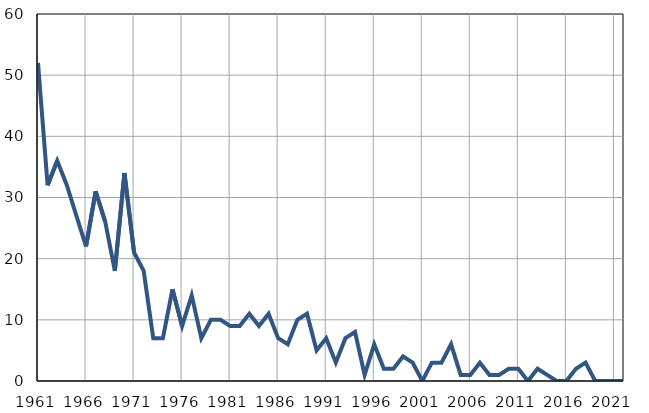
| Category | Infants
deaths |
|---|---|
| 1961.0 | 52 |
| 1962.0 | 32 |
| 1963.0 | 36 |
| 1964.0 | 32 |
| 1965.0 | 27 |
| 1966.0 | 22 |
| 1967.0 | 31 |
| 1968.0 | 26 |
| 1969.0 | 18 |
| 1970.0 | 34 |
| 1971.0 | 21 |
| 1972.0 | 18 |
| 1973.0 | 7 |
| 1974.0 | 7 |
| 1975.0 | 15 |
| 1976.0 | 9 |
| 1977.0 | 14 |
| 1978.0 | 7 |
| 1979.0 | 10 |
| 1980.0 | 10 |
| 1981.0 | 9 |
| 1982.0 | 9 |
| 1983.0 | 11 |
| 1984.0 | 9 |
| 1985.0 | 11 |
| 1986.0 | 7 |
| 1987.0 | 6 |
| 1988.0 | 10 |
| 1989.0 | 11 |
| 1990.0 | 5 |
| 1991.0 | 7 |
| 1992.0 | 3 |
| 1993.0 | 7 |
| 1994.0 | 8 |
| 1995.0 | 1 |
| 1996.0 | 6 |
| 1997.0 | 2 |
| 1998.0 | 2 |
| 1999.0 | 4 |
| 2000.0 | 3 |
| 2001.0 | 0 |
| 2002.0 | 3 |
| 2003.0 | 3 |
| 2004.0 | 6 |
| 2005.0 | 1 |
| 2006.0 | 1 |
| 2007.0 | 3 |
| 2008.0 | 1 |
| 2009.0 | 1 |
| 2010.0 | 2 |
| 2011.0 | 2 |
| 2012.0 | 0 |
| 2013.0 | 2 |
| 2014.0 | 1 |
| 2015.0 | 0 |
| 2016.0 | 0 |
| 2017.0 | 2 |
| 2018.0 | 3 |
| 2019.0 | 0 |
| 2020.0 | 0 |
| 2021.0 | 0 |
| 2022.0 | 0 |